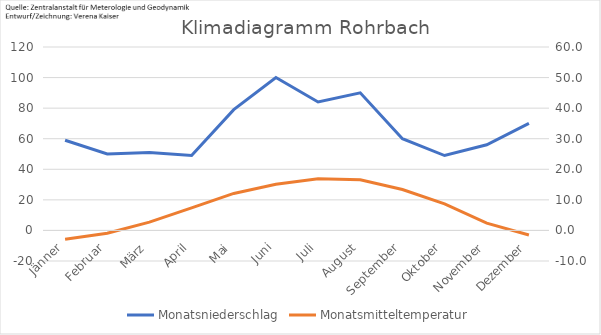
| Category | Monatsniederschlag |
|---|---|
| Jänner | 59 |
| Februar | 50 |
| März | 51 |
| April | 49 |
| Mai | 79 |
| Juni | 100 |
| Juli | 84 |
| August | 90 |
| September | 60 |
| Oktober | 49 |
| November | 56 |
| Dezember | 70 |